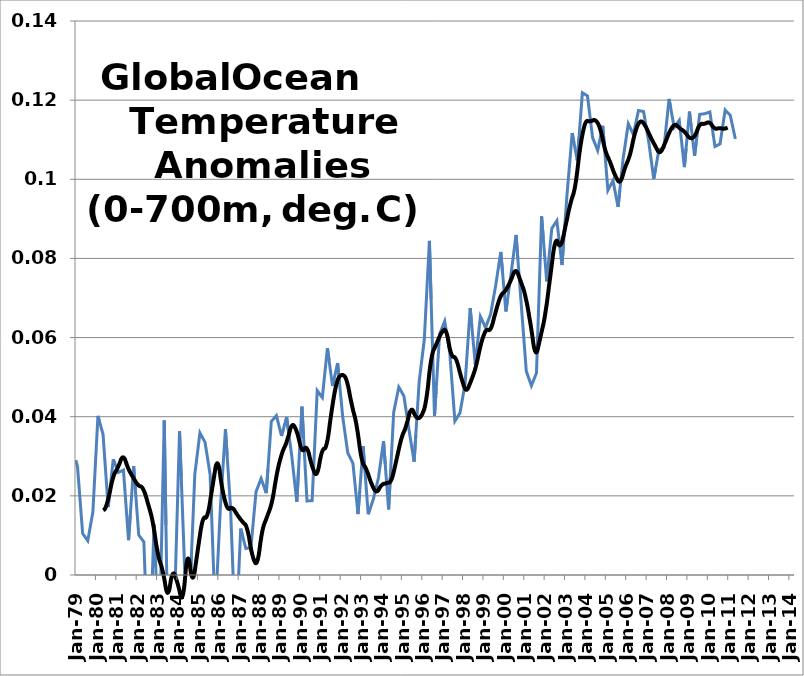
| Category | Series 0 |
|---|---|
| 1979-01-01 | 0.029 |
| 1979-02-01 | 0.027 |
| 1979-03-01 | 0.022 |
| 1979-04-01 | 0.016 |
| 1979-05-01 | 0.01 |
| 1979-06-01 | 0.01 |
| 1979-07-01 | 0.009 |
| 1979-08-01 | 0.009 |
| 1979-09-01 | 0.011 |
| 1979-10-01 | 0.013 |
| 1979-11-01 | 0.016 |
| 1979-12-01 | 0.024 |
| 1980-01-01 | 0.032 |
| 1980-02-01 | 0.04 |
| 1980-03-01 | 0.039 |
| 1980-04-01 | 0.037 |
| 1980-05-01 | 0.036 |
| 1980-06-01 | 0.029 |
| 1980-07-01 | 0.023 |
| 1980-08-01 | 0.017 |
| 1980-09-01 | 0.021 |
| 1980-10-01 | 0.025 |
| 1980-11-01 | 0.029 |
| 1980-12-01 | 0.028 |
| 1981-01-01 | 0.027 |
| 1981-02-01 | 0.026 |
| 1981-03-01 | 0.026 |
| 1981-04-01 | 0.026 |
| 1981-05-01 | 0.027 |
| 1981-06-01 | 0.021 |
| 1981-07-01 | 0.015 |
| 1981-08-01 | 0.009 |
| 1981-09-01 | 0.015 |
| 1981-10-01 | 0.021 |
| 1981-11-01 | 0.028 |
| 1981-12-01 | 0.022 |
| 1982-01-01 | 0.016 |
| 1982-02-01 | 0.01 |
| 1982-03-01 | 0.01 |
| 1982-04-01 | 0.009 |
| 1982-05-01 | 0.008 |
| 1982-06-01 | -0.003 |
| 1982-07-01 | -0.015 |
| 1982-08-01 | -0.026 |
| 1982-09-01 | -0.013 |
| 1982-10-01 | 0 |
| 1982-11-01 | 0.013 |
| 1982-12-01 | 0.002 |
| 1983-01-01 | -0.009 |
| 1983-02-01 | -0.02 |
| 1983-03-01 | 0 |
| 1983-04-01 | 0.019 |
| 1983-05-01 | 0.039 |
| 1983-06-01 | 0.013 |
| 1983-07-01 | -0.014 |
| 1983-08-01 | -0.04 |
| 1983-09-01 | -0.03 |
| 1983-10-01 | -0.019 |
| 1983-11-01 | -0.009 |
| 1983-12-01 | 0.006 |
| 1984-01-01 | 0.021 |
| 1984-02-01 | 0.036 |
| 1984-03-01 | 0.025 |
| 1984-04-01 | 0.013 |
| 1984-05-01 | 0.002 |
| 1984-06-01 | -0.001 |
| 1984-07-01 | -0.003 |
| 1984-08-01 | -0.005 |
| 1984-09-01 | 0.005 |
| 1984-10-01 | 0.015 |
| 1984-11-01 | 0.025 |
| 1984-12-01 | 0.029 |
| 1985-01-01 | 0.032 |
| 1985-02-01 | 0.036 |
| 1985-03-01 | 0.035 |
| 1985-04-01 | 0.034 |
| 1985-05-01 | 0.034 |
| 1985-06-01 | 0.031 |
| 1985-07-01 | 0.028 |
| 1985-08-01 | 0.025 |
| 1985-09-01 | 0.014 |
| 1985-10-01 | 0.002 |
| 1985-11-01 | -0.01 |
| 1985-12-01 | -0.001 |
| 1986-01-01 | 0.008 |
| 1986-02-01 | 0.017 |
| 1986-03-01 | 0.023 |
| 1986-04-01 | 0.03 |
| 1986-05-01 | 0.037 |
| 1986-06-01 | 0.03 |
| 1986-07-01 | 0.024 |
| 1986-08-01 | 0.017 |
| 1986-09-01 | 0.006 |
| 1986-10-01 | -0.006 |
| 1986-11-01 | -0.017 |
| 1986-12-01 | -0.007 |
| 1987-01-01 | 0.002 |
| 1987-02-01 | 0.012 |
| 1987-03-01 | 0.01 |
| 1987-04-01 | 0.008 |
| 1987-05-01 | 0.007 |
| 1987-06-01 | 0.007 |
| 1987-07-01 | 0.007 |
| 1987-08-01 | 0.007 |
| 1987-09-01 | 0.012 |
| 1987-10-01 | 0.016 |
| 1987-11-01 | 0.021 |
| 1987-12-01 | 0.022 |
| 1988-01-01 | 0.023 |
| 1988-02-01 | 0.024 |
| 1988-03-01 | 0.023 |
| 1988-04-01 | 0.022 |
| 1988-05-01 | 0.021 |
| 1988-06-01 | 0.027 |
| 1988-07-01 | 0.033 |
| 1988-08-01 | 0.039 |
| 1988-09-01 | 0.039 |
| 1988-10-01 | 0.04 |
| 1988-11-01 | 0.04 |
| 1988-12-01 | 0.039 |
| 1989-01-01 | 0.037 |
| 1989-02-01 | 0.035 |
| 1989-03-01 | 0.037 |
| 1989-04-01 | 0.038 |
| 1989-05-01 | 0.04 |
| 1989-06-01 | 0.037 |
| 1989-07-01 | 0.033 |
| 1989-08-01 | 0.03 |
| 1989-09-01 | 0.026 |
| 1989-10-01 | 0.022 |
| 1989-11-01 | 0.018 |
| 1989-12-01 | 0.026 |
| 1990-01-01 | 0.035 |
| 1990-02-01 | 0.043 |
| 1990-03-01 | 0.035 |
| 1990-04-01 | 0.027 |
| 1990-05-01 | 0.019 |
| 1990-06-01 | 0.019 |
| 1990-07-01 | 0.019 |
| 1990-08-01 | 0.019 |
| 1990-09-01 | 0.028 |
| 1990-10-01 | 0.037 |
| 1990-11-01 | 0.047 |
| 1990-12-01 | 0.046 |
| 1991-01-01 | 0.045 |
| 1991-02-01 | 0.045 |
| 1991-03-01 | 0.049 |
| 1991-04-01 | 0.053 |
| 1991-05-01 | 0.057 |
| 1991-06-01 | 0.054 |
| 1991-07-01 | 0.051 |
| 1991-08-01 | 0.048 |
| 1991-09-01 | 0.05 |
| 1991-10-01 | 0.052 |
| 1991-11-01 | 0.054 |
| 1991-12-01 | 0.049 |
| 1992-01-01 | 0.045 |
| 1992-02-01 | 0.04 |
| 1992-03-01 | 0.037 |
| 1992-04-01 | 0.034 |
| 1992-05-01 | 0.031 |
| 1992-06-01 | 0.03 |
| 1992-07-01 | 0.029 |
| 1992-08-01 | 0.028 |
| 1992-09-01 | 0.024 |
| 1992-10-01 | 0.02 |
| 1992-11-01 | 0.015 |
| 1992-12-01 | 0.021 |
| 1993-01-01 | 0.027 |
| 1993-02-01 | 0.033 |
| 1993-03-01 | 0.027 |
| 1993-04-01 | 0.021 |
| 1993-05-01 | 0.015 |
| 1993-06-01 | 0.017 |
| 1993-07-01 | 0.018 |
| 1993-08-01 | 0.019 |
| 1993-09-01 | 0.021 |
| 1993-10-01 | 0.023 |
| 1993-11-01 | 0.025 |
| 1993-12-01 | 0.028 |
| 1994-01-01 | 0.031 |
| 1994-02-01 | 0.034 |
| 1994-03-01 | 0.028 |
| 1994-04-01 | 0.022 |
| 1994-05-01 | 0.017 |
| 1994-06-01 | 0.025 |
| 1994-07-01 | 0.033 |
| 1994-08-01 | 0.041 |
| 1994-09-01 | 0.043 |
| 1994-10-01 | 0.045 |
| 1994-11-01 | 0.047 |
| 1994-12-01 | 0.047 |
| 1995-01-01 | 0.046 |
| 1995-02-01 | 0.045 |
| 1995-03-01 | 0.042 |
| 1995-04-01 | 0.04 |
| 1995-05-01 | 0.037 |
| 1995-06-01 | 0.034 |
| 1995-07-01 | 0.031 |
| 1995-08-01 | 0.029 |
| 1995-09-01 | 0.035 |
| 1995-10-01 | 0.042 |
| 1995-11-01 | 0.049 |
| 1995-12-01 | 0.052 |
| 1996-01-01 | 0.056 |
| 1996-02-01 | 0.06 |
| 1996-03-01 | 0.068 |
| 1996-04-01 | 0.076 |
| 1996-05-01 | 0.084 |
| 1996-06-01 | 0.07 |
| 1996-07-01 | 0.055 |
| 1996-08-01 | 0.04 |
| 1996-09-01 | 0.047 |
| 1996-10-01 | 0.054 |
| 1996-11-01 | 0.061 |
| 1996-12-01 | 0.062 |
| 1997-01-01 | 0.063 |
| 1997-02-01 | 0.064 |
| 1997-03-01 | 0.061 |
| 1997-04-01 | 0.059 |
| 1997-05-01 | 0.056 |
| 1997-06-01 | 0.05 |
| 1997-07-01 | 0.045 |
| 1997-08-01 | 0.039 |
| 1997-09-01 | 0.04 |
| 1997-10-01 | 0.04 |
| 1997-11-01 | 0.041 |
| 1997-12-01 | 0.043 |
| 1998-01-01 | 0.046 |
| 1998-02-01 | 0.048 |
| 1998-03-01 | 0.055 |
| 1998-04-01 | 0.061 |
| 1998-05-01 | 0.067 |
| 1998-06-01 | 0.063 |
| 1998-07-01 | 0.058 |
| 1998-08-01 | 0.053 |
| 1998-09-01 | 0.057 |
| 1998-10-01 | 0.061 |
| 1998-11-01 | 0.065 |
| 1998-12-01 | 0.064 |
| 1999-01-01 | 0.063 |
| 1999-02-01 | 0.063 |
| 1999-03-01 | 0.064 |
| 1999-04-01 | 0.065 |
| 1999-05-01 | 0.066 |
| 1999-06-01 | 0.068 |
| 1999-07-01 | 0.071 |
| 1999-08-01 | 0.073 |
| 1999-09-01 | 0.076 |
| 1999-10-01 | 0.079 |
| 1999-11-01 | 0.082 |
| 1999-12-01 | 0.077 |
| 2000-01-01 | 0.072 |
| 2000-02-01 | 0.067 |
| 2000-03-01 | 0.07 |
| 2000-04-01 | 0.073 |
| 2000-05-01 | 0.076 |
| 2000-06-01 | 0.079 |
| 2000-07-01 | 0.083 |
| 2000-08-01 | 0.086 |
| 2000-09-01 | 0.08 |
| 2000-10-01 | 0.074 |
| 2000-11-01 | 0.069 |
| 2000-12-01 | 0.063 |
| 2001-01-01 | 0.057 |
| 2001-02-01 | 0.052 |
| 2001-03-01 | 0.05 |
| 2001-04-01 | 0.049 |
| 2001-05-01 | 0.048 |
| 2001-06-01 | 0.049 |
| 2001-07-01 | 0.05 |
| 2001-08-01 | 0.051 |
| 2001-09-01 | 0.064 |
| 2001-10-01 | 0.077 |
| 2001-11-01 | 0.091 |
| 2001-12-01 | 0.085 |
| 2002-01-01 | 0.08 |
| 2002-02-01 | 0.074 |
| 2002-03-01 | 0.079 |
| 2002-04-01 | 0.083 |
| 2002-05-01 | 0.088 |
| 2002-06-01 | 0.088 |
| 2002-07-01 | 0.089 |
| 2002-08-01 | 0.09 |
| 2002-09-01 | 0.086 |
| 2002-10-01 | 0.082 |
| 2002-11-01 | 0.078 |
| 2002-12-01 | 0.084 |
| 2003-01-01 | 0.09 |
| 2003-02-01 | 0.096 |
| 2003-03-01 | 0.101 |
| 2003-04-01 | 0.107 |
| 2003-05-01 | 0.112 |
| 2003-06-01 | 0.109 |
| 2003-07-01 | 0.107 |
| 2003-08-01 | 0.105 |
| 2003-09-01 | 0.11 |
| 2003-10-01 | 0.116 |
| 2003-11-01 | 0.122 |
| 2003-12-01 | 0.122 |
| 2004-01-01 | 0.121 |
| 2004-02-01 | 0.121 |
| 2004-03-01 | 0.118 |
| 2004-04-01 | 0.114 |
| 2004-05-01 | 0.111 |
| 2004-06-01 | 0.109 |
| 2004-07-01 | 0.108 |
| 2004-08-01 | 0.107 |
| 2004-09-01 | 0.109 |
| 2004-10-01 | 0.111 |
| 2004-11-01 | 0.114 |
| 2004-12-01 | 0.108 |
| 2005-01-01 | 0.103 |
| 2005-02-01 | 0.097 |
| 2005-03-01 | 0.098 |
| 2005-04-01 | 0.099 |
| 2005-05-01 | 0.1 |
| 2005-06-01 | 0.097 |
| 2005-07-01 | 0.095 |
| 2005-08-01 | 0.093 |
| 2005-09-01 | 0.097 |
| 2005-10-01 | 0.101 |
| 2005-11-01 | 0.105 |
| 2005-12-01 | 0.108 |
| 2006-01-01 | 0.111 |
| 2006-02-01 | 0.114 |
| 2006-03-01 | 0.113 |
| 2006-04-01 | 0.112 |
| 2006-05-01 | 0.111 |
| 2006-06-01 | 0.113 |
| 2006-07-01 | 0.115 |
| 2006-08-01 | 0.117 |
| 2006-09-01 | 0.117 |
| 2006-10-01 | 0.117 |
| 2006-11-01 | 0.117 |
| 2006-12-01 | 0.115 |
| 2007-01-01 | 0.112 |
| 2007-02-01 | 0.11 |
| 2007-03-01 | 0.106 |
| 2007-04-01 | 0.103 |
| 2007-05-01 | 0.1 |
| 2007-06-01 | 0.103 |
| 2007-07-01 | 0.105 |
| 2007-08-01 | 0.107 |
| 2007-09-01 | 0.108 |
| 2007-10-01 | 0.108 |
| 2007-11-01 | 0.108 |
| 2007-12-01 | 0.112 |
| 2008-01-01 | 0.116 |
| 2008-02-01 | 0.12 |
| 2008-03-01 | 0.118 |
| 2008-04-01 | 0.116 |
| 2008-05-01 | 0.113 |
| 2008-06-01 | 0.114 |
| 2008-07-01 | 0.114 |
| 2008-08-01 | 0.115 |
| 2008-09-01 | 0.111 |
| 2008-10-01 | 0.107 |
| 2008-11-01 | 0.103 |
| 2008-12-01 | 0.108 |
| 2009-01-01 | 0.112 |
| 2009-02-01 | 0.117 |
| 2009-03-01 | 0.113 |
| 2009-04-01 | 0.11 |
| 2009-05-01 | 0.106 |
| 2009-06-01 | 0.109 |
| 2009-07-01 | 0.113 |
| 2009-08-01 | 0.116 |
| 2009-09-01 | 0.116 |
| 2009-10-01 | 0.117 |
| 2009-11-01 | 0.117 |
| 2009-12-01 | 0.117 |
| 2010-01-01 | 0.117 |
| 2010-02-01 | 0.117 |
| 2010-03-01 | 0.114 |
| 2010-04-01 | 0.111 |
| 2010-05-01 | 0.108 |
| 2010-06-01 | 0.109 |
| 2010-07-01 | 0.109 |
| 2010-08-01 | 0.109 |
| 2010-09-01 | 0.112 |
| 2010-10-01 | 0.115 |
| 2010-11-01 | 0.118 |
| 2010-12-01 | 0.117 |
| 2011-01-01 | 0.117 |
| 2011-02-01 | 0.116 |
| 2011-03-01 | 0.114 |
| 2011-04-01 | 0.112 |
| 2011-05-01 | 0.11 |